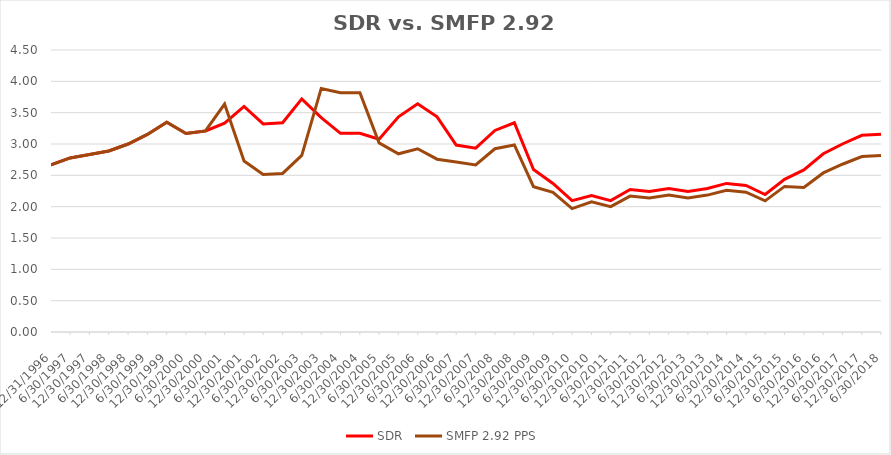
| Category | SDR | SMFP 2.92 PPS |
|---|---|---|
| 12/31/96 | 2.667 | 2.667 |
| 6/30/97 | 2.778 | 2.778 |
| 12/31/97 | 2.833 | 2.833 |
| 6/30/98 | 2.889 | 2.889 |
| 12/31/98 | 3 | 3 |
| 6/30/99 | 3.153 | 3.153 |
| 12/31/99 | 3.347 | 3.347 |
| 6/30/00 | 3.167 | 3.167 |
| 12/31/00 | 3.208 | 3.208 |
| 6/30/01 | 3.333 | 3.636 |
| 12/31/01 | 3.6 | 2.727 |
| 6/30/02 | 3.32 | 2.515 |
| 12/31/02 | 3.34 | 2.53 |
| 6/30/03 | 3.72 | 2.818 |
| 12/31/03 | 3.42 | 3.886 |
| 6/30/04 | 3.17 | 3.818 |
| 12/31/04 | 3.17 | 3.818 |
| 6/30/05 | 3.075 | 3.019 |
| 12/31/05 | 3.434 | 2.844 |
| 6/30/06 | 3.642 | 2.924 |
| 12/31/06 | 3.434 | 2.758 |
| 6/30/07 | 2.983 | 2.712 |
| 12/31/07 | 2.933 | 2.667 |
| 6/30/08 | 3.217 | 2.924 |
| 12/31/08 | 3.339 | 2.985 |
| 6/30/09 | 2.593 | 2.318 |
| 12/31/09 | 2.371 | 2.227 |
| 6/30/10 | 2.097 | 1.97 |
| 12/31/10 | 2.177 | 2.077 |
| 6/30/11 | 2.097 | 2 |
| 12/31/11 | 2.274 | 2.169 |
| 6/30/12 | 2.242 | 2.138 |
| 12/31/12 | 2.29 | 2.185 |
| 6/30/13 | 2.242 | 2.138 |
| 12/31/13 | 2.29 | 2.185 |
| 6/30/14 | 2.371 | 2.262 |
| 12/31/14 | 2.339 | 2.231 |
| 6/30/15 | 2.194 | 2.092 |
| 12/31/15 | 2.435 | 2.323 |
| 6/30/16 | 2.586 | 2.308 |
| 12/31/16 | 2.845 | 2.538 |
| 6/30/17 | 3 | 2.677 |
| 12/31/17 | 3.138 | 2.8 |
| 6/30/18 | 3.155 | 2.815 |